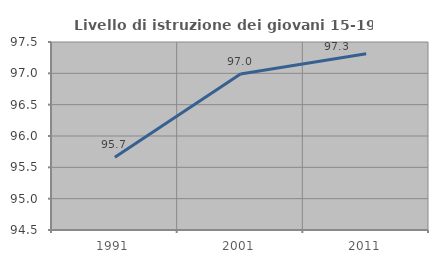
| Category | Livello di istruzione dei giovani 15-19 anni |
|---|---|
| 1991.0 | 95.659 |
| 2001.0 | 96.989 |
| 2011.0 | 97.314 |